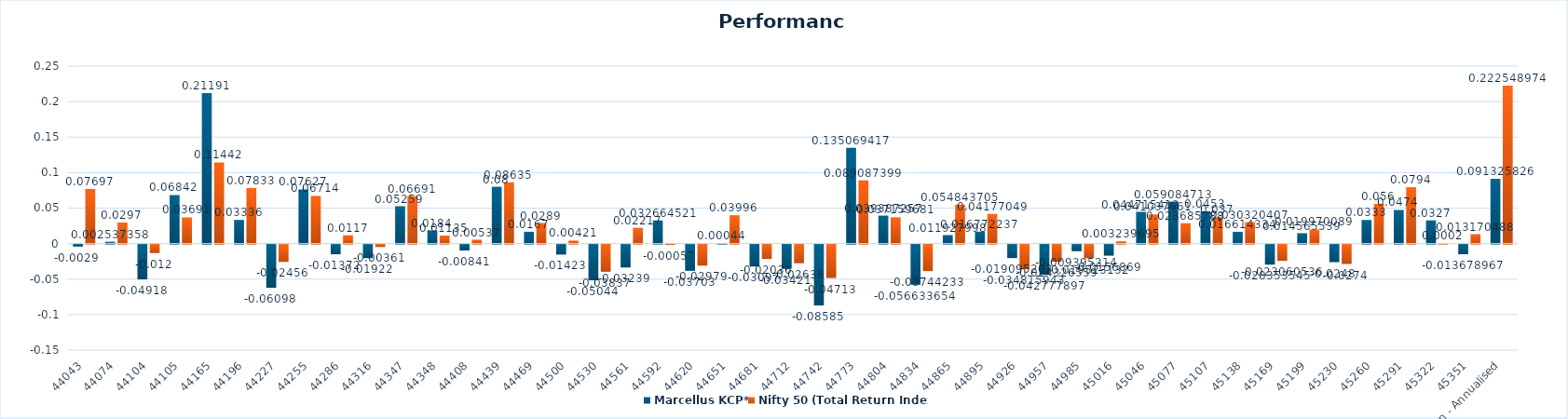
| Category | Marcellus KCP* | Nifty 50 (Total Return Index) |
|---|---|---|
| 44043 | -0.003 | 0.077 |
| 44074 | 0.003 | 0.03 |
| 44104 | -0.049 | -0.012 |
| 44105 | 0.068 | 0.037 |
| 44165 | 0.212 | 0.114 |
| 44196 | 0.033 | 0.078 |
| 44227 | -0.061 | -0.025 |
| 44255 | 0.076 | 0.067 |
| 44286 | -0.014 | 0.012 |
| 44316 | -0.019 | -0.004 |
| 44347 | 0.053 | 0.067 |
| 44348 | 0.018 | 0.011 |
| 44408 | -0.008 | 0.005 |
| 44439 | 0.08 | 0.086 |
| 44469 | 0.017 | 0.029 |
| 44500 | -0.014 | 0.004 |
| 44530 | -0.05 | -0.038 |
| 44561 | -0.032 | 0.022 |
| 44592 | 0.033 | -0.001 |
| 44620 | -0.037 | -0.03 |
| 44651 | 0 | 0.04 |
| 44681 | -0.031 | -0.02 |
| 44712 | -0.034 | -0.026 |
| 44742 | -0.086 | -0.047 |
| 44773 | 0.135 | 0.089 |
| 44804 | 0.039 | 0.037 |
| 44834 | -0.057 | -0.037 |
| 44865 | 0.012 | 0.055 |
| 44895 | 0.017 | 0.042 |
| 44926 | -0.019 | -0.035 |
| 44957 | -0.043 | -0.024 |
| 44985 | -0.009 | -0.02 |
| 45016 | -0.016 | 0.003 |
| 45046 | 0.045 | 0.041 |
| 45077 | 0.059 | 0.029 |
| 45107 | 0.045 | 0.037 |
| 45138 | 0.017 | 0.03 |
| 45169 | -0.028 | -0.023 |
| 45199 | 0.015 | 0.02 |
| 45230 | -0.025 | -0.027 |
| 45260 | 0.033 | 0.056 |
| 45291 | 0.047 | 0.079 |
| 45322 | 0.033 | 0 |
| 45351 | -0.014 | 0.013 |
| Inception - Annualised | 0.091 | 0.223 |